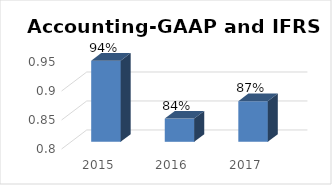
| Category | Series 1 |
|---|---|
| 2015.0 | 0.94 |
| 2016.0 | 0.84 |
| 2017.0 | 0.87 |